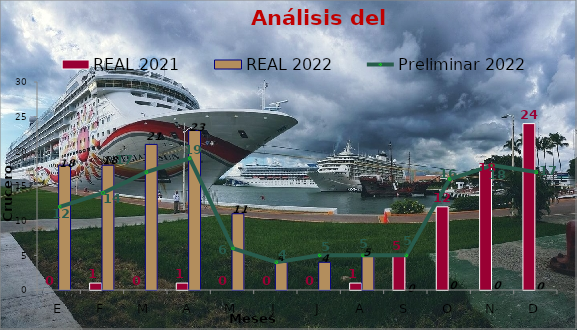
| Category | REAL 2021 | REAL 2022 |
|---|---|---|
| E | 0 | 18 |
| F | 1 | 18 |
| M | 0 | 21 |
| A | 1 | 23 |
| M | 0 | 11 |
| J | 0 | 4 |
| J | 0 | 4 |
| A | 1 | 5 |
| S | 5 | 0 |
| O | 12 | 0 |
| N | 18 | 0 |
| D | 24 | 0 |